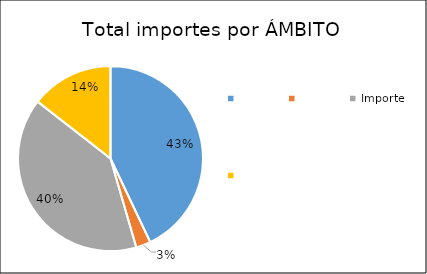
| Category | Total xeral |
|---|---|
| 0 | 4894481 |
| 1 | 292820 |
| 2 | 4562640.03 |
| 3 | 1649254 |